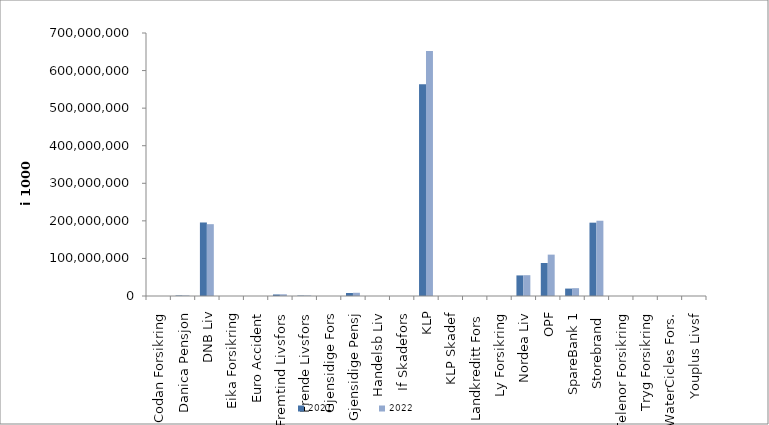
| Category | 2021 | 2022 |
|---|---|---|
| Codan Forsikring | 0 | 0 |
| Danica Pensjon | 1358359.769 | 1409067.966 |
| DNB Liv | 195668621.746 | 191155192 |
| Eika Forsikring | 0 | 0 |
| Euro Accident | 0 | 0 |
| Fremtind Livsfors | 4079532.452 | 4531256.157 |
| Frende Livsfors | 1134700 | 1351782 |
| Gjensidige Fors | 0 | 0 |
| Gjensidige Pensj | 7988385 | 8598193 |
| Handelsb Liv | 20421.387 | 25475.116 |
| If Skadefors | 0 | 0 |
| KLP | 563636708.307 | 651822235.957 |
| KLP Skadef | 67448.82 | 90495.556 |
| Landkreditt Fors | 0 | 0 |
| Ly Forsikring | 0 | 0 |
| Nordea Liv | 54800660 | 55369880 |
| OPF | 87821000 | 110112000 |
| SpareBank 1 | 19758215.866 | 20841895.884 |
| Storebrand  | 195179233.263 | 200339753.172 |
| Telenor Forsikring | 0 | 0 |
| Tryg Forsikring | 0 | 0 |
| WaterCicles Fors. | 0 | 0 |
| Youplus Livsf | 0 | 1794 |